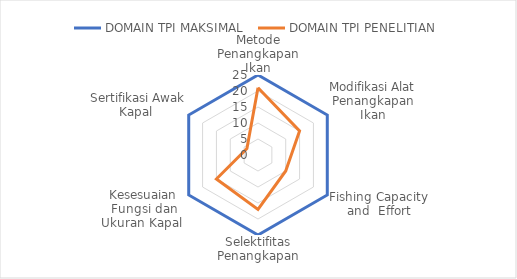
| Category | DOMAIN TPI MAKSIMAL  | DOMAIN TPI PENELITIAN  |
|---|---|---|
| Metode Penangkapan Ikan | 25 | 21 |
| Modifikasi Alat Penangkapan Ikan | 25 | 15 |
| Fishing Capacity and  Effort | 25 | 10 |
| Selektifitas Penangkapan | 25 | 17 |
| Kesesuaian Fungsi dan Ukuran Kapal  | 25 | 15 |
| Sertifikasi Awak Kapal  | 25 | 4 |